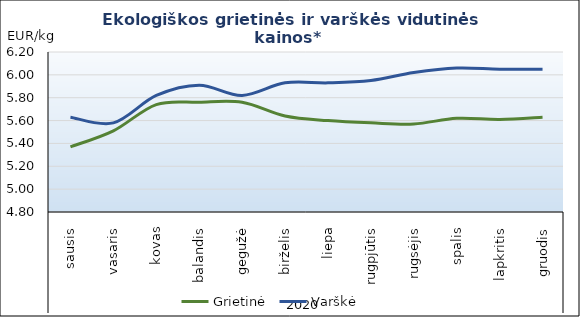
| Category | Grietinė | Varškė |
|---|---|---|
| 0 | 5.37 | 5.63 |
| 1 | 5.51 | 5.58 |
| 2 | 5.74 | 5.82 |
| 3 | 5.76 | 5.91 |
| 4 | 5.76 | 5.82 |
| 5 | 5.64 | 5.93 |
| 6 | 5.6 | 5.93 |
| 7 | 5.58 | 5.95 |
| 8 | 5.57 | 6.02 |
| 9 | 5.62 | 6.06 |
| 10 | 5.61 | 6.05 |
| 11 | 5.63 | 6.05 |